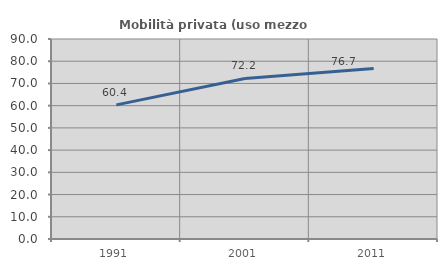
| Category | Mobilità privata (uso mezzo privato) |
|---|---|
| 1991.0 | 60.352 |
| 2001.0 | 72.245 |
| 2011.0 | 76.704 |